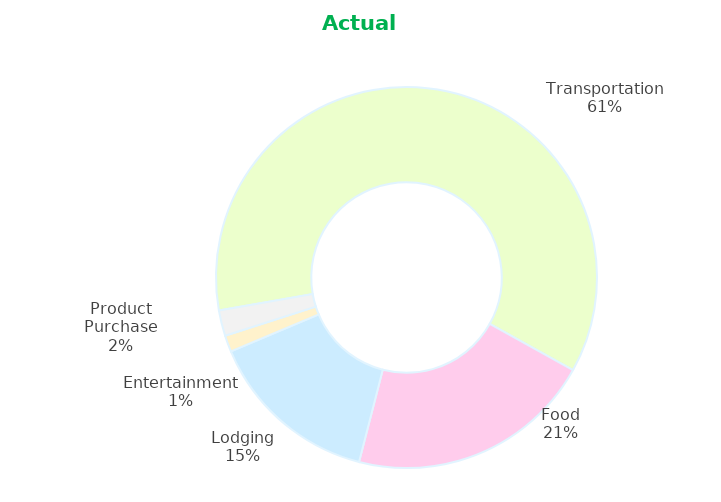
| Category | Series 0 |
|---|---|
| Transportation | 436 |
| Food | 150 |
| Lodging | 105 |
| Entertainment | 10 |
| Product Purchase | 15.5 |
| Reserve Fund | 0 |